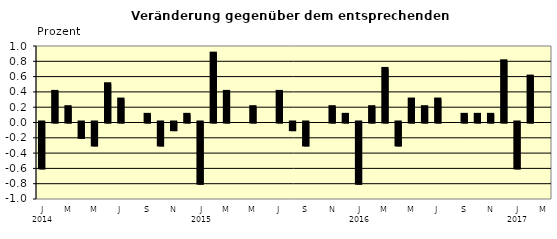
| Category | Series 0 |
|---|---|
| 0 | -0.6 |
| 1 | 0.4 |
| 2 | 0.2 |
| 3 | -0.2 |
| 4 | -0.3 |
| 5 | 0.5 |
| 6 | 0.3 |
| 7 | 0 |
| 8 | 0.1 |
| 9 | -0.3 |
| 10 | -0.1 |
| 11 | 0.1 |
| 12 | -0.8 |
| 13 | 0.9 |
| 14 | 0.4 |
| 15 | 0 |
| 16 | 0.2 |
| 17 | 0 |
| 18 | 0.4 |
| 19 | -0.1 |
| 20 | -0.3 |
| 21 | 0 |
| 22 | 0.2 |
| 23 | 0.1 |
| 24 | -0.8 |
| 25 | 0.2 |
| 26 | 0.7 |
| 27 | -0.3 |
| 28 | 0.3 |
| 29 | 0.2 |
| 30 | 0.3 |
| 31 | 0 |
| 32 | 0.1 |
| 33 | 0.1 |
| 34 | 0.1 |
| 35 | 0.8 |
| 36 | -0.6 |
| 37 | 0.6 |
| 38 | 0 |